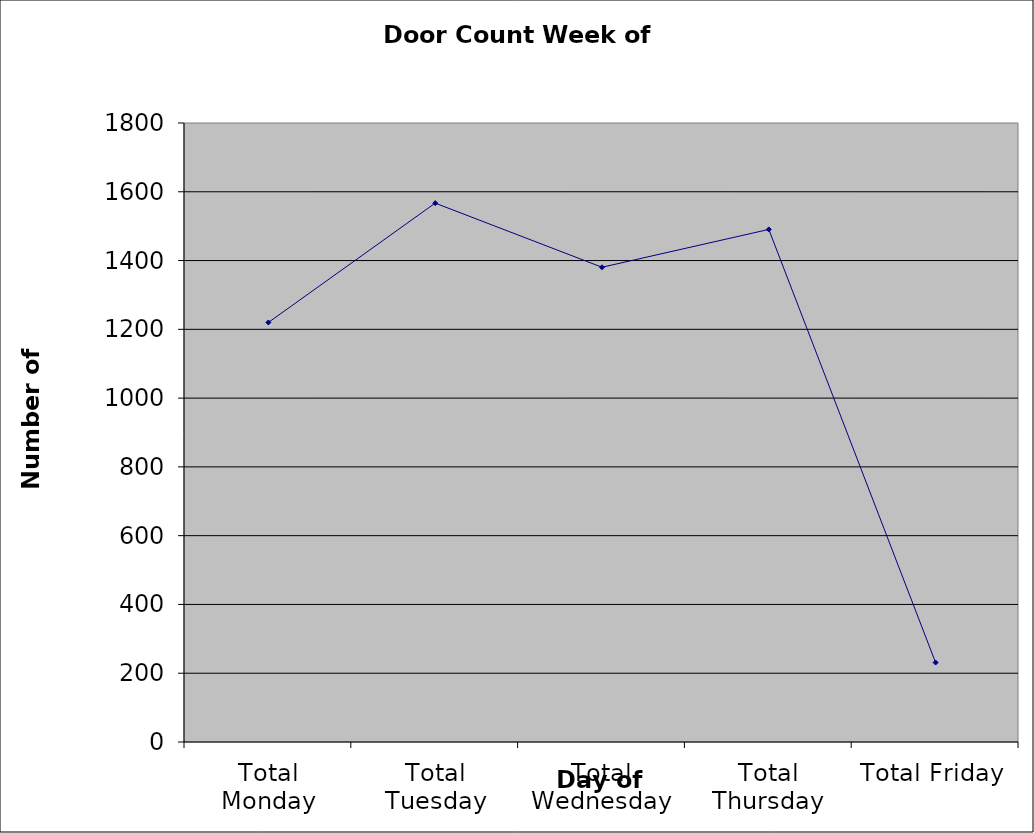
| Category | Series 0 |
|---|---|
| Total Monday | 1220 |
| Total Tuesday | 1567 |
| Total Wednesday | 1380.5 |
| Total Thursday | 1490.5 |
| Total Friday | 231 |